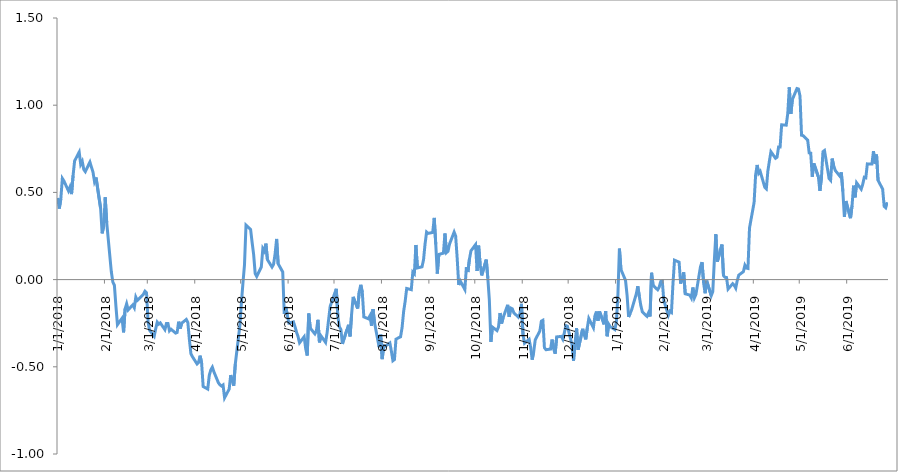
| Category | Series 0 |
|---|---|
| 1/1/18 | 0.468 |
| 1/2/18 | 0.407 |
| 1/3/18 | 0.463 |
| 1/4/18 | 0.58 |
| 1/5/18 | 0.566 |
| 1/8/18 | 0.508 |
| 1/9/18 | 0.531 |
| 1/10/18 | 0.49 |
| 1/11/18 | 0.596 |
| 1/12/18 | 0.68 |
| 1/15/18 | 0.731 |
| 1/16/18 | 0.661 |
| 1/17/18 | 0.678 |
| 1/18/18 | 0.631 |
| 1/19/18 | 0.619 |
| 1/22/18 | 0.674 |
| 1/23/18 | 0.645 |
| 1/24/18 | 0.617 |
| 1/25/18 | 0.563 |
| 1/26/18 | 0.585 |
| 1/29/18 | 0.409 |
| 1/30/18 | 0.265 |
| 1/31/18 | 0.305 |
| 2/1/18 | 0.472 |
| 2/2/18 | 0.325 |
| 2/5/18 | 0.045 |
| 2/6/18 | -0.015 |
| 2/7/18 | -0.033 |
| 2/8/18 | -0.152 |
| 2/9/18 | -0.259 |
| 2/12/18 | -0.222 |
| 2/13/18 | -0.302 |
| 2/14/18 | -0.168 |
| 2/15/18 | -0.139 |
| 2/16/18 | -0.174 |
| 2/19/18 | -0.145 |
| 2/20/18 | -0.161 |
| 2/21/18 | -0.1 |
| 2/22/18 | -0.119 |
| 2/23/18 | -0.111 |
| 2/26/18 | -0.084 |
| 2/27/18 | -0.067 |
| 2/28/18 | -0.076 |
| 3/1/18 | -0.243 |
| 3/2/18 | -0.29 |
| 3/5/18 | -0.325 |
| 3/6/18 | -0.282 |
| 3/7/18 | -0.244 |
| 3/8/18 | -0.256 |
| 3/9/18 | -0.248 |
| 3/12/18 | -0.287 |
| 3/13/18 | -0.252 |
| 3/14/18 | -0.252 |
| 3/15/18 | -0.294 |
| 3/16/18 | -0.284 |
| 3/19/18 | -0.307 |
| 3/20/18 | -0.303 |
| 3/21/18 | -0.241 |
| 3/22/18 | -0.281 |
| 3/23/18 | -0.25 |
| 3/26/18 | -0.228 |
| 3/27/18 | -0.246 |
| 3/28/18 | -0.343 |
| 3/29/18 | -0.425 |
| 3/30/18 | -0.442 |
| 4/2/18 | -0.483 |
| 4/3/18 | -0.475 |
| 4/4/18 | -0.436 |
| 4/5/18 | -0.478 |
| 4/6/18 | -0.613 |
| 4/9/18 | -0.628 |
| 4/10/18 | -0.549 |
| 4/11/18 | -0.518 |
| 4/12/18 | -0.502 |
| 4/13/18 | -0.528 |
| 4/16/18 | -0.592 |
| 4/17/18 | -0.604 |
| 4/18/18 | -0.611 |
| 4/19/18 | -0.604 |
| 4/20/18 | -0.678 |
| 4/23/18 | -0.628 |
| 4/24/18 | -0.548 |
| 4/25/18 | -0.581 |
| 4/26/18 | -0.608 |
| 4/27/18 | -0.485 |
| 4/30/18 | -0.262 |
| 5/1/18 | -0.133 |
| 5/2/18 | -0.02 |
| 5/3/18 | 0.083 |
| 5/4/18 | 0.312 |
| 5/7/18 | 0.288 |
| 5/8/18 | 0.213 |
| 5/9/18 | 0.144 |
| 5/10/18 | 0.035 |
| 5/11/18 | 0.019 |
| 5/14/18 | 0.072 |
| 5/15/18 | 0.178 |
| 5/16/18 | 0.163 |
| 5/17/18 | 0.206 |
| 5/18/18 | 0.114 |
| 5/21/18 | 0.072 |
| 5/22/18 | 0.087 |
| 5/23/18 | 0.146 |
| 5/24/18 | 0.233 |
| 5/25/18 | 0.091 |
| 5/28/18 | 0.044 |
| 5/29/18 | -0.196 |
| 5/30/18 | -0.156 |
| 5/31/18 | -0.205 |
| 6/1/18 | -0.249 |
| 6/4/18 | -0.242 |
| 6/5/18 | -0.269 |
| 6/6/18 | -0.301 |
| 6/7/18 | -0.326 |
| 6/8/18 | -0.362 |
| 6/11/18 | -0.328 |
| 6/12/18 | -0.396 |
| 6/13/18 | -0.435 |
| 6/14/18 | -0.195 |
| 6/15/18 | -0.278 |
| 6/18/18 | -0.311 |
| 6/19/18 | -0.293 |
| 6/20/18 | -0.231 |
| 6/21/18 | -0.36 |
| 6/22/18 | -0.323 |
| 6/25/18 | -0.36 |
| 6/26/18 | -0.304 |
| 6/27/18 | -0.228 |
| 6/28/18 | -0.153 |
| 6/29/18 | -0.128 |
| 7/2/18 | -0.053 |
| 7/3/18 | -0.21 |
| 7/4/18 | -0.27 |
| 7/5/18 | -0.285 |
| 7/6/18 | -0.368 |
| 7/9/18 | -0.286 |
| 7/10/18 | -0.259 |
| 7/11/18 | -0.326 |
| 7/12/18 | -0.199 |
| 7/13/18 | -0.099 |
| 7/16/18 | -0.165 |
| 7/17/18 | -0.07 |
| 7/18/18 | -0.03 |
| 7/19/18 | -0.073 |
| 7/20/18 | -0.214 |
| 7/23/18 | -0.225 |
| 7/24/18 | -0.208 |
| 7/25/18 | -0.265 |
| 7/26/18 | -0.169 |
| 7/27/18 | -0.248 |
| 7/30/18 | -0.388 |
| 7/31/18 | -0.316 |
| 8/1/18 | -0.456 |
| 8/2/18 | -0.379 |
| 8/3/18 | -0.382 |
| 8/6/18 | -0.363 |
| 8/7/18 | -0.411 |
| 8/8/18 | -0.465 |
| 8/9/18 | -0.458 |
| 8/10/18 | -0.342 |
| 8/13/18 | -0.328 |
| 8/14/18 | -0.274 |
| 8/15/18 | -0.183 |
| 8/16/18 | -0.124 |
| 8/17/18 | -0.051 |
| 8/20/18 | -0.058 |
| 8/21/18 | 0.043 |
| 8/22/18 | 0.034 |
| 8/23/18 | 0.199 |
| 8/24/18 | 0.067 |
| 8/27/18 | 0.073 |
| 8/28/18 | 0.113 |
| 8/29/18 | 0.204 |
| 8/30/18 | 0.273 |
| 8/31/18 | 0.265 |
| 9/3/18 | 0.27 |
| 9/4/18 | 0.354 |
| 9/5/18 | 0.202 |
| 9/6/18 | 0.035 |
| 9/7/18 | 0.144 |
| 9/10/18 | 0.152 |
| 9/11/18 | 0.264 |
| 9/12/18 | 0.155 |
| 9/13/18 | 0.163 |
| 9/14/18 | 0.204 |
| 9/17/18 | 0.272 |
| 9/18/18 | 0.249 |
| 9/19/18 | 0.121 |
| 9/20/18 | -0.031 |
| 9/21/18 | -0.007 |
| 9/24/18 | -0.057 |
| 9/25/18 | 0.071 |
| 9/26/18 | 0.043 |
| 9/27/18 | 0.117 |
| 9/28/18 | 0.165 |
| 10/1/18 | 0.201 |
| 10/2/18 | 0.049 |
| 10/3/18 | 0.195 |
| 10/4/18 | 0.086 |
| 10/5/18 | 0.024 |
| 10/8/18 | 0.114 |
| 10/9/18 | 0.009 |
| 10/10/18 | -0.115 |
| 10/11/18 | -0.357 |
| 10/12/18 | -0.272 |
| 10/15/18 | -0.292 |
| 10/16/18 | -0.271 |
| 10/17/18 | -0.192 |
| 10/18/18 | -0.252 |
| 10/19/18 | -0.219 |
| 10/22/18 | -0.145 |
| 10/23/18 | -0.214 |
| 10/24/18 | -0.163 |
| 10/25/18 | -0.167 |
| 10/26/18 | -0.19 |
| 10/29/18 | -0.215 |
| 10/30/18 | -0.197 |
| 10/31/18 | -0.139 |
| 11/1/18 | -0.316 |
| 11/2/18 | -0.365 |
| 11/5/18 | -0.342 |
| 11/6/18 | -0.389 |
| 11/7/18 | -0.459 |
| 11/8/18 | -0.413 |
| 11/9/18 | -0.345 |
| 11/12/18 | -0.295 |
| 11/13/18 | -0.238 |
| 11/14/18 | -0.233 |
| 11/15/18 | -0.39 |
| 11/16/18 | -0.402 |
| 11/19/18 | -0.398 |
| 11/20/18 | -0.344 |
| 11/21/18 | -0.397 |
| 11/22/18 | -0.425 |
| 11/23/18 | -0.329 |
| 11/26/18 | -0.326 |
| 11/27/18 | -0.342 |
| 11/28/18 | -0.306 |
| 11/29/18 | -0.264 |
| 11/30/18 | -0.267 |
| 12/3/18 | -0.372 |
| 12/4/18 | -0.465 |
| 12/5/18 | -0.365 |
| 12/6/18 | -0.279 |
| 12/7/18 | -0.402 |
| 12/10/18 | -0.282 |
| 12/11/18 | -0.317 |
| 12/12/18 | -0.343 |
| 12/13/18 | -0.277 |
| 12/14/18 | -0.223 |
| 12/17/18 | -0.276 |
| 12/18/18 | -0.208 |
| 12/19/18 | -0.183 |
| 12/20/18 | -0.236 |
| 12/21/18 | -0.183 |
| 12/24/18 | -0.256 |
| 12/25/18 | -0.18 |
| 12/26/18 | -0.325 |
| 12/27/18 | -0.256 |
| 12/28/18 | -0.27 |
| 12/31/18 | -0.287 |
| 1/1/19 | -0.245 |
| 1/2/19 | -0.091 |
| 1/3/19 | 0.178 |
| 1/4/19 | 0.058 |
| 1/7/19 | -0.005 |
| 1/8/19 | -0.088 |
| 1/9/19 | -0.214 |
| 1/10/19 | -0.194 |
| 1/11/19 | -0.173 |
| 1/14/19 | -0.083 |
| 1/15/19 | -0.038 |
| 1/16/19 | -0.097 |
| 1/17/19 | -0.149 |
| 1/18/19 | -0.186 |
| 1/21/19 | -0.211 |
| 1/22/19 | -0.191 |
| 1/23/19 | -0.211 |
| 1/24/19 | 0.039 |
| 1/25/19 | -0.034 |
| 1/28/19 | -0.058 |
| 1/29/19 | -0.043 |
| 1/30/19 | -0.011 |
| 1/31/19 | -0.008 |
| 2/1/19 | -0.119 |
| 2/4/19 | -0.205 |
| 2/5/19 | -0.181 |
| 2/6/19 | -0.188 |
| 2/7/19 | -0.023 |
| 2/8/19 | 0.111 |
| 2/11/19 | 0.1 |
| 2/12/19 | -0.023 |
| 2/13/19 | 0.006 |
| 2/14/19 | 0.042 |
| 2/15/19 | -0.081 |
| 2/18/19 | -0.089 |
| 2/19/19 | -0.105 |
| 2/20/19 | -0.045 |
| 2/21/19 | -0.104 |
| 2/22/19 | -0.085 |
| 2/25/19 | 0.075 |
| 2/26/19 | 0.1 |
| 2/27/19 | -0.019 |
| 2/28/19 | -0.078 |
| 3/1/19 | -0.006 |
| 3/4/19 | -0.092 |
| 3/5/19 | -0.069 |
| 3/6/19 | 0.106 |
| 3/7/19 | 0.26 |
| 3/8/19 | 0.103 |
| 3/11/19 | 0.201 |
| 3/12/19 | 0.023 |
| 3/13/19 | 0.013 |
| 3/14/19 | 0.012 |
| 3/15/19 | -0.054 |
| 3/18/19 | -0.024 |
| 3/19/19 | -0.032 |
| 3/20/19 | -0.049 |
| 3/21/19 | -0.005 |
| 3/22/19 | 0.026 |
| 3/25/19 | 0.045 |
| 3/26/19 | 0.082 |
| 3/27/19 | 0.066 |
| 3/28/19 | 0.064 |
| 3/29/19 | 0.296 |
| 4/1/19 | 0.442 |
| 4/2/19 | 0.6 |
| 4/3/19 | 0.657 |
| 4/4/19 | 0.609 |
| 4/5/19 | 0.62 |
| 4/8/19 | 0.529 |
| 4/9/19 | 0.521 |
| 4/10/19 | 0.622 |
| 4/11/19 | 0.68 |
| 4/12/19 | 0.733 |
| 4/15/19 | 0.696 |
| 4/16/19 | 0.702 |
| 4/17/19 | 0.761 |
| 4/18/19 | 0.761 |
| 4/19/19 | 0.888 |
| 4/22/19 | 0.886 |
| 4/23/19 | 0.952 |
| 4/24/19 | 1.102 |
| 4/25/19 | 0.95 |
| 4/26/19 | 1.032 |
| 4/29/19 | 1.095 |
| 4/30/19 | 1.093 |
| 5/1/19 | 1.053 |
| 5/2/19 | 0.828 |
| 5/3/19 | 0.826 |
| 5/6/19 | 0.8 |
| 5/7/19 | 0.727 |
| 5/8/19 | 0.725 |
| 5/9/19 | 0.59 |
| 5/10/19 | 0.667 |
| 5/13/19 | 0.589 |
| 5/14/19 | 0.509 |
| 5/15/19 | 0.583 |
| 5/16/19 | 0.733 |
| 5/17/19 | 0.74 |
| 5/20/19 | 0.58 |
| 5/21/19 | 0.57 |
| 5/22/19 | 0.694 |
| 5/23/19 | 0.654 |
| 5/24/19 | 0.626 |
| 5/27/19 | 0.594 |
| 5/28/19 | 0.615 |
| 5/29/19 | 0.505 |
| 5/30/19 | 0.359 |
| 5/31/19 | 0.45 |
| 6/3/19 | 0.352 |
| 6/4/19 | 0.424 |
| 6/5/19 | 0.539 |
| 6/6/19 | 0.472 |
| 6/7/19 | 0.555 |
| 6/10/19 | 0.519 |
| 6/11/19 | 0.547 |
| 6/12/19 | 0.587 |
| 6/13/19 | 0.584 |
| 6/14/19 | 0.664 |
| 6/17/19 | 0.663 |
| 6/18/19 | 0.736 |
| 6/19/19 | 0.665 |
| 6/20/19 | 0.717 |
| 6/21/19 | 0.569 |
| 6/24/19 | 0.519 |
| 6/25/19 | 0.42 |
| 6/26/19 | 0.412 |
| 6/27/19 | 0.444 |